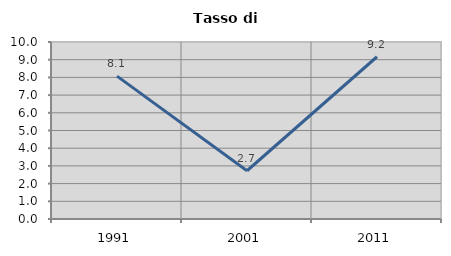
| Category | Tasso di disoccupazione   |
|---|---|
| 1991.0 | 8.071 |
| 2001.0 | 2.726 |
| 2011.0 | 9.167 |